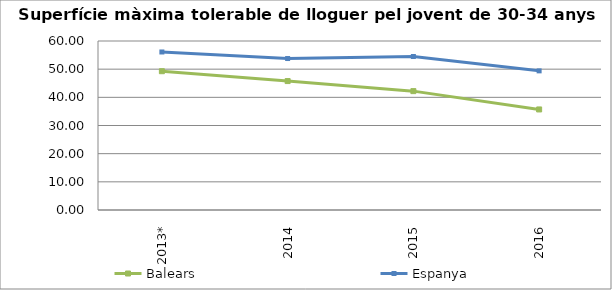
| Category | Balears | Espanya |
|---|---|---|
| 2013* | 49.275 | 56.1 |
| 2014 | 45.775 | 53.775 |
| 2015 | 42.2 | 54.5 |
| 2016 | 35.7 | 49.4 |